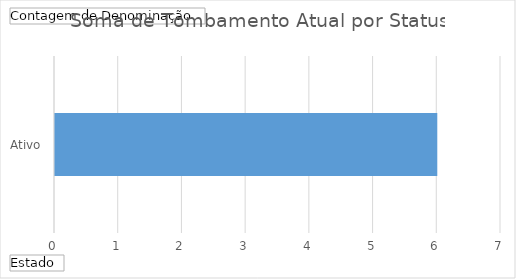
| Category | Total |
|---|---|
| Ativo | 6 |